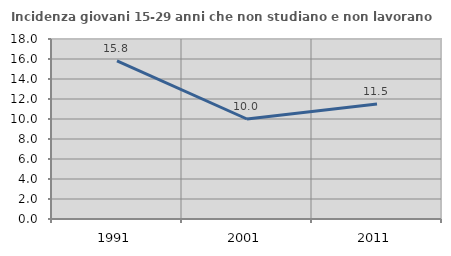
| Category | Incidenza giovani 15-29 anni che non studiano e non lavorano  |
|---|---|
| 1991.0 | 15.804 |
| 2001.0 | 10 |
| 2011.0 | 11.494 |